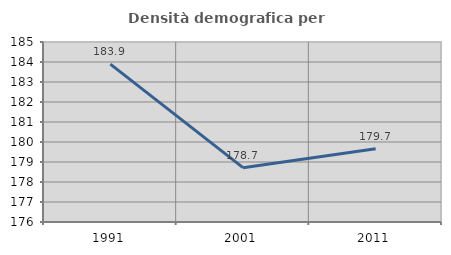
| Category | Densità demografica |
|---|---|
| 1991.0 | 183.894 |
| 2001.0 | 178.717 |
| 2011.0 | 179.666 |